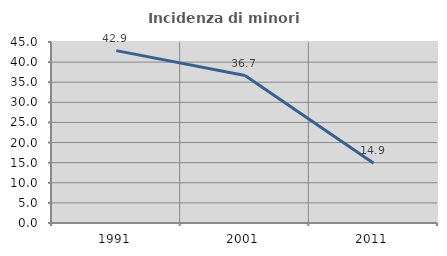
| Category | Incidenza di minori stranieri |
|---|---|
| 1991.0 | 42.857 |
| 2001.0 | 36.667 |
| 2011.0 | 14.865 |